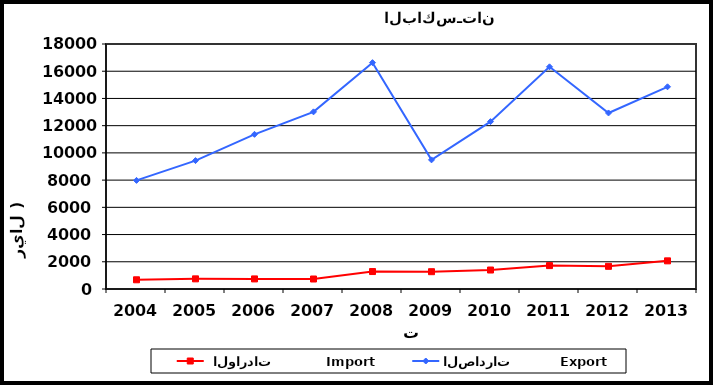
| Category |  الواردات           Import | الصادرات          Export |
|---|---|---|
| 2004.0 | 677 | 7979 |
| 2005.0 | 746 | 9435 |
| 2006.0 | 741 | 11363 |
| 2007.0 | 734 | 13015 |
| 2008.0 | 1283 | 16630 |
| 2009.0 | 1271 | 9487 |
| 2010.0 | 1394 | 12298 |
| 2011.0 | 1719 | 16323 |
| 2012.0 | 1666 | 12933 |
| 2013.0 | 2068 | 14856 |